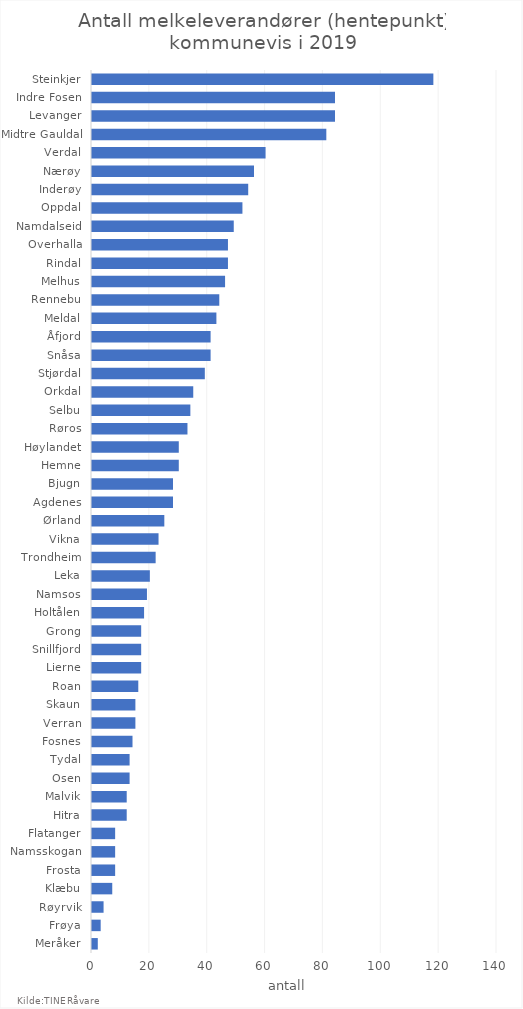
| Category | Totalt |
|---|---|
| Meråker | 2 |
| Frøya | 3 |
| Røyrvik | 4 |
| Klæbu | 7 |
| Frosta | 8 |
| Namsskogan | 8 |
| Flatanger | 8 |
| Hitra | 12 |
| Malvik | 12 |
| Osen | 13 |
| Tydal | 13 |
| Fosnes | 14 |
| Verran | 15 |
| Skaun | 15 |
| Roan | 16 |
| Lierne | 17 |
| Snillfjord | 17 |
| Grong | 17 |
| Holtålen | 18 |
| Namsos | 19 |
| Leka | 20 |
| Trondheim | 22 |
| Vikna | 23 |
| Ørland | 25 |
| Agdenes | 28 |
| Bjugn | 28 |
| Hemne | 30 |
| Høylandet | 30 |
| Røros | 33 |
| Selbu | 34 |
| Orkdal | 35 |
| Stjørdal | 39 |
| Snåsa | 41 |
| Åfjord | 41 |
| Meldal | 43 |
| Rennebu | 44 |
| Melhus | 46 |
| Rindal | 47 |
| Overhalla | 47 |
| Namdalseid | 49 |
| Oppdal | 52 |
| Inderøy | 54 |
| Nærøy | 56 |
| Verdal | 60 |
| Midtre Gauldal | 81 |
| Levanger | 84 |
| Indre Fosen | 84 |
| Steinkjer | 118 |